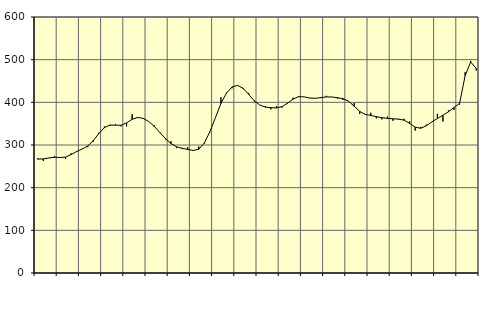
| Category | Piggar | Series 1 |
|---|---|---|
| nan | 269.5 | 266.78 |
| 1.0 | 262.8 | 267.42 |
| 1.0 | 269.8 | 269.55 |
| 1.0 | 274.3 | 271.25 |
| nan | 270.4 | 270.71 |
| 2.0 | 267.5 | 271.68 |
| 2.0 | 280.4 | 277.41 |
| 2.0 | 285.9 | 284.68 |
| nan | 291.4 | 290.55 |
| 3.0 | 294.9 | 297.56 |
| 3.0 | 307.5 | 310.14 |
| 3.0 | 328.8 | 326.82 |
| nan | 343.5 | 340.56 |
| 4.0 | 345.3 | 346.85 |
| 4.0 | 348.6 | 346.57 |
| 4.0 | 343.7 | 346.14 |
| nan | 343.6 | 351.82 |
| 5.0 | 372.2 | 360.26 |
| 5.0 | 364.1 | 364.64 |
| 5.0 | 361.4 | 362.33 |
| nan | 354.9 | 354.96 |
| 6.0 | 346 | 343.56 |
| 6.0 | 328 | 329.16 |
| 6.0 | 313.3 | 315.14 |
| nan | 308.7 | 303.35 |
| 7.0 | 292.7 | 295.8 |
| 7.0 | 290.5 | 292.33 |
| 7.0 | 294.7 | 289.65 |
| nan | 286.2 | 287.25 |
| 8.0 | 296.4 | 290.03 |
| 8.0 | 303.2 | 304.44 |
| 8.0 | 329.2 | 330.92 |
| nan | 363.7 | 363.66 |
| 9.0 | 411.8 | 397.23 |
| 9.0 | 422.6 | 421.59 |
| 9.0 | 433 | 435.95 |
| nan | 439.4 | 439.77 |
| 10.0 | 431 | 432.9 |
| 10.0 | 422 | 418.53 |
| 10.0 | 402.2 | 403.74 |
| nan | 393.5 | 393.75 |
| 11.0 | 391 | 388.88 |
| 11.0 | 383.4 | 387.4 |
| 11.0 | 391.2 | 386.91 |
| nan | 387.6 | 389.8 |
| 12.0 | 396.9 | 397.97 |
| 12.0 | 410.8 | 407.58 |
| 12.0 | 414.6 | 413.34 |
| nan | 412.9 | 412.8 |
| 13.0 | 409.5 | 410.16 |
| 13.0 | 409.1 | 409.45 |
| 13.0 | 410 | 411.03 |
| nan | 415.2 | 412.73 |
| 14.0 | 412.5 | 412.5 |
| 14.0 | 408.6 | 410.82 |
| 14.0 | 405.9 | 408.61 |
| nan | 403.1 | 402.54 |
| 15.0 | 398.4 | 390.86 |
| 15.0 | 372.9 | 378.69 |
| 15.0 | 371.3 | 371.82 |
| nan | 375.6 | 369.12 |
| 16.0 | 362.4 | 366.57 |
| 16.0 | 360.1 | 363.95 |
| 16.0 | 366.5 | 362.48 |
| nan | 356.9 | 361.45 |
| 17.0 | 359.5 | 360.75 |
| 17.0 | 361.4 | 358.24 |
| 17.0 | 355.5 | 350.66 |
| nan | 333.7 | 341.83 |
| 18.0 | 342.4 | 339.19 |
| 18.0 | 348.1 | 344.98 |
| 18.0 | 353.6 | 354.1 |
| nan | 373 | 362.13 |
| 19.0 | 355.2 | 369.81 |
| 19.0 | 381.2 | 377.91 |
| 19.0 | 382.2 | 387.93 |
| nan | 394.5 | 397.61 |
| 20.0 | 470.5 | 462.5 |
| 20.0 | 497.2 | 494.64 |
| 20.0 | 474.6 | 479.58 |